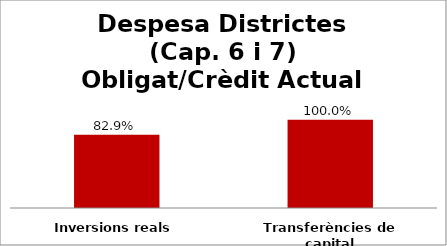
| Category | Series 0 |
|---|---|
| Inversions reals | 0.829 |
| Transferències de capital | 1 |